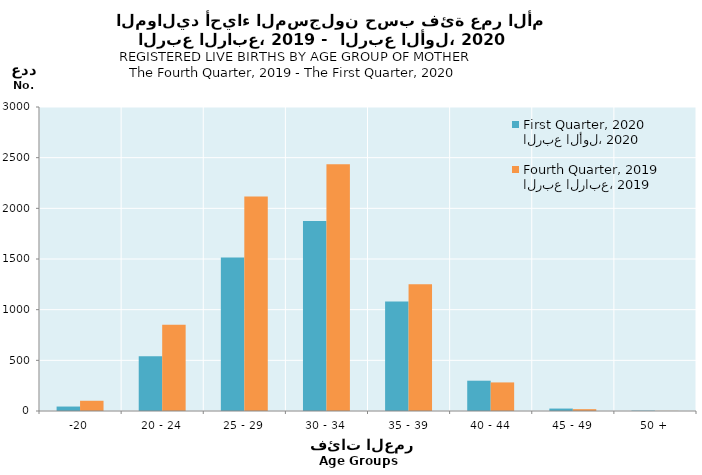
| Category | الربع الأول، 2020
First Quarter, 2020 | الربع الرابع، 2019
Fourth Quarter, 2019 |
|---|---|---|
| -20 | 44 | 101 |
| 20 - 24 | 541 | 852 |
| 25 - 29 | 1516 | 2117 |
| 30 - 34 | 1874 | 2435 |
| 35 - 39 | 1081 | 1250 |
| 40 - 44 | 299 | 282 |
| 45 - 49 | 24 | 18 |
| 50 + | 4 | 1 |